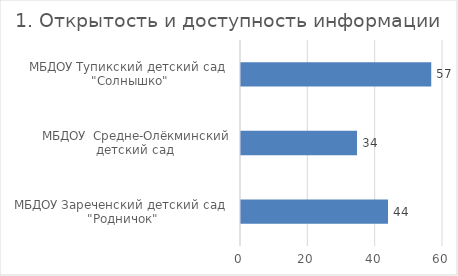
| Category | 1. Открытость и доступность информации |
|---|---|
| МБДОУ Зареченский детский сад  "Родничок" | 43.669 |
| МБДОУ  Средне-Олёкминский детский сад  | 34.455 |
| МБДОУ Тупикский детский сад  "Солнышко" | 56.51 |